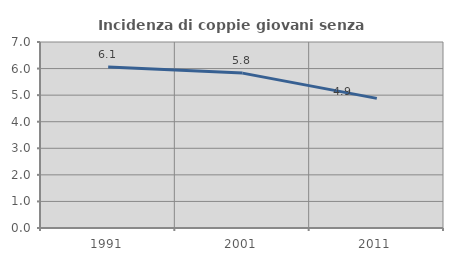
| Category | Incidenza di coppie giovani senza figli |
|---|---|
| 1991.0 | 6.056 |
| 2001.0 | 5.829 |
| 2011.0 | 4.879 |